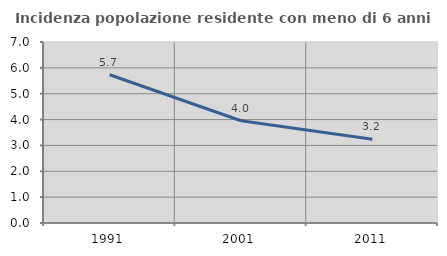
| Category | Incidenza popolazione residente con meno di 6 anni |
|---|---|
| 1991.0 | 5.734 |
| 2001.0 | 3.953 |
| 2011.0 | 3.237 |